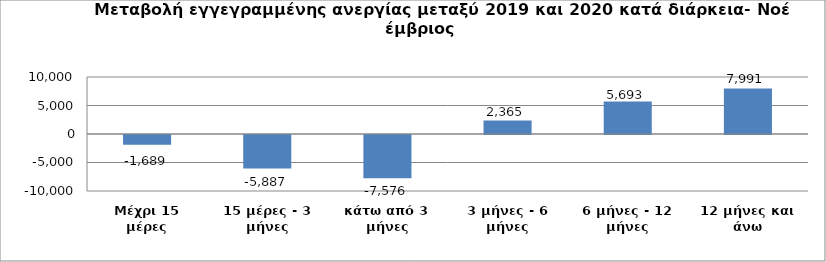
| Category | Series 0 |
|---|---|
| Μέχρι 15 μέρες | -1689 |
| 15 μέρες - 3 μήνες | -5887 |
| κάτω από 3 μήνες | -7576 |
| 3 μήνες - 6 μήνες | 2365 |
| 6 μήνες - 12 μήνες | 5693 |
| 12 μήνες και άνω | 7991 |